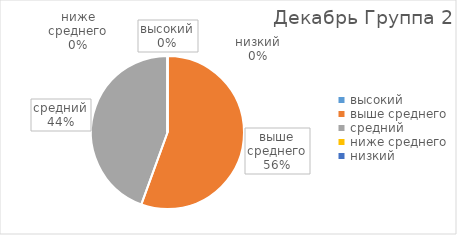
| Category | Series 0 |
|---|---|
| высокий | 0 |
| выше среднего | 5 |
| средний | 4 |
| ниже среднего | 0 |
| низкий | 0 |